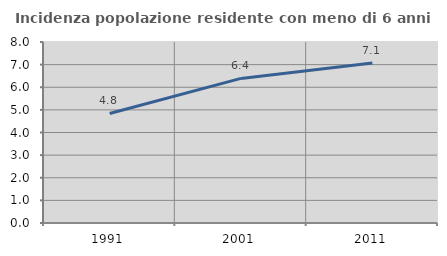
| Category | Incidenza popolazione residente con meno di 6 anni |
|---|---|
| 1991.0 | 4.842 |
| 2001.0 | 6.391 |
| 2011.0 | 7.07 |